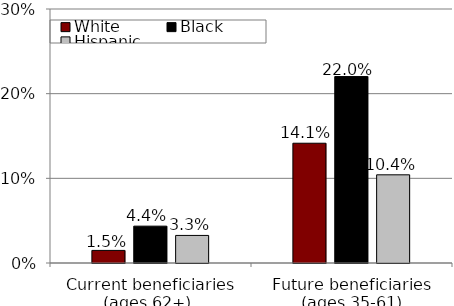
| Category | White | Black | Hispanic |
|---|---|---|---|
| Current beneficiaries
(ages 62+)  | 0.015 | 0.044 | 0.033 |
| Future beneficiaries
(ages 35-61) | 0.141 | 0.22 | 0.104 |